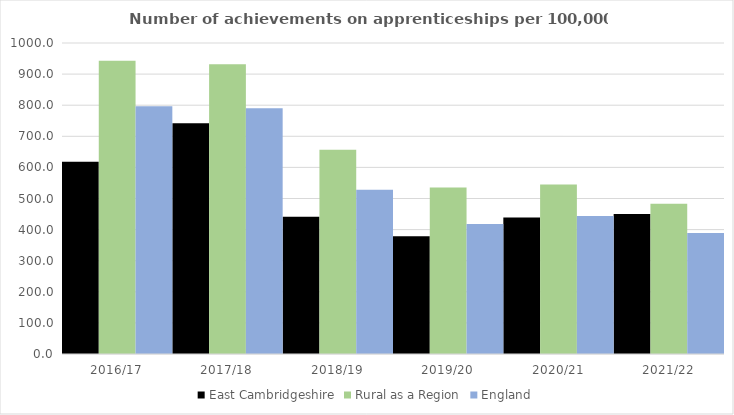
| Category | East Cambridgeshire | Rural as a Region | England |
|---|---|---|---|
| 2016/17 | 618 | 942.594 | 797 |
| 2017/18 | 742 | 931.709 | 790 |
| 2018/19 | 441 | 656.44 | 528 |
| 2019/20 | 379 | 535.552 | 418 |
| 2020/21 | 439 | 545.333 | 444 |
| 2021/22 | 450 | 482.936 | 389 |